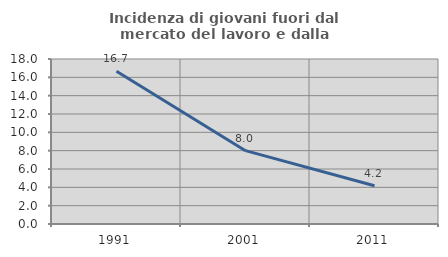
| Category | Incidenza di giovani fuori dal mercato del lavoro e dalla formazione  |
|---|---|
| 1991.0 | 16.667 |
| 2001.0 | 8 |
| 2011.0 | 4.167 |